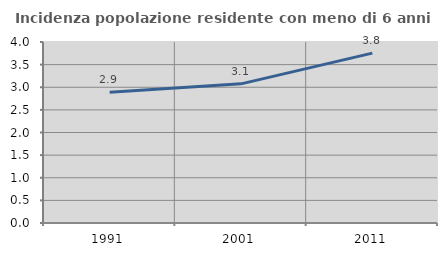
| Category | Incidenza popolazione residente con meno di 6 anni |
|---|---|
| 1991.0 | 2.89 |
| 2001.0 | 3.075 |
| 2011.0 | 3.754 |